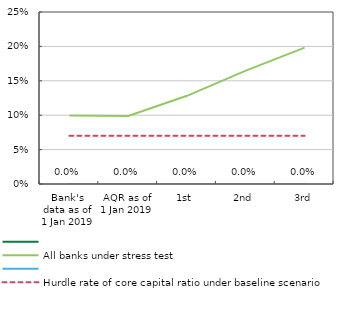
| Category | Series 0 | All banks under stress test | Series 3 | Hurdle rate of core capital ratio under baseline scenario |
|---|---|---|---|---|
| Bank's data as of 1 Jan 2019 | 0 | 0.1 | 0 | 0.07 |
| AQR as of 1 Jan 2019 | 0 | 0.099 | 0 | 0.07 |
| 1st | 0 | 0.128 | 0 | 0.07 |
| 2nd | 0 | 0.165 | 0 | 0.07 |
| 3rd | 0 | 0.198 | 0 | 0.07 |